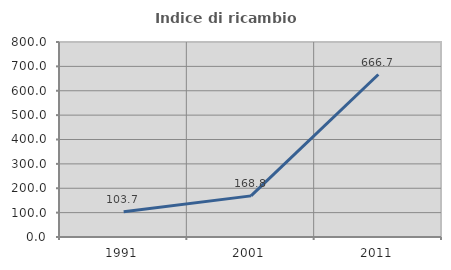
| Category | Indice di ricambio occupazionale  |
|---|---|
| 1991.0 | 103.704 |
| 2001.0 | 168.75 |
| 2011.0 | 666.667 |